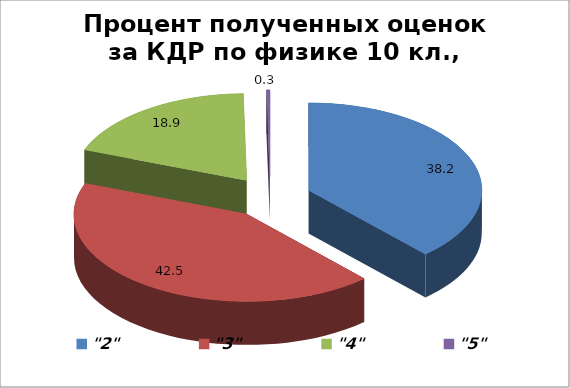
| Category | Series 0 |
|---|---|
| "2" | 38.199 |
| "3" | 42.547 |
| "4" | 18.944 |
| "5" | 0.311 |